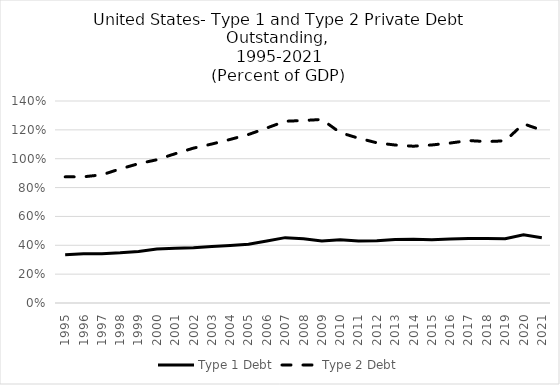
| Category | Type 1 Debt | Type 2 Debt |
|---|---|---|
| 1995.0 | 0.334 | 0.874 |
| 1996.0 | 0.341 | 0.875 |
| 1997.0 | 0.341 | 0.888 |
| 1998.0 | 0.348 | 0.929 |
| 1999.0 | 0.357 | 0.966 |
| 2000.0 | 0.374 | 0.993 |
| 2001.0 | 0.379 | 1.035 |
| 2002.0 | 0.382 | 1.073 |
| 2003.0 | 0.392 | 1.102 |
| 2004.0 | 0.399 | 1.134 |
| 2005.0 | 0.407 | 1.168 |
| 2006.0 | 0.429 | 1.213 |
| 2007.0 | 0.453 | 1.26 |
| 2008.0 | 0.446 | 1.265 |
| 2009.0 | 0.429 | 1.272 |
| 2010.0 | 0.437 | 1.181 |
| 2011.0 | 0.429 | 1.142 |
| 2012.0 | 0.431 | 1.11 |
| 2013.0 | 0.441 | 1.095 |
| 2014.0 | 0.442 | 1.087 |
| 2015.0 | 0.438 | 1.095 |
| 2016.0 | 0.444 | 1.109 |
| 2017.0 | 0.447 | 1.126 |
| 2018.0 | 0.447 | 1.119 |
| 2019.0 | 0.445 | 1.124 |
| 2020.0 | 0.473 | 1.242 |
| 2021.0 | 0.452 | 1.198 |